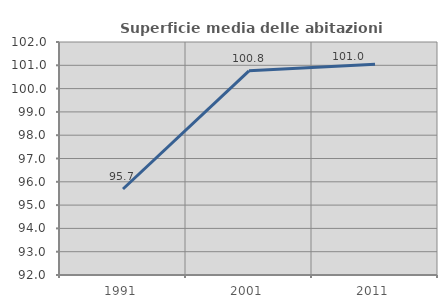
| Category | Superficie media delle abitazioni occupate |
|---|---|
| 1991.0 | 95.692 |
| 2001.0 | 100.761 |
| 2011.0 | 101.048 |